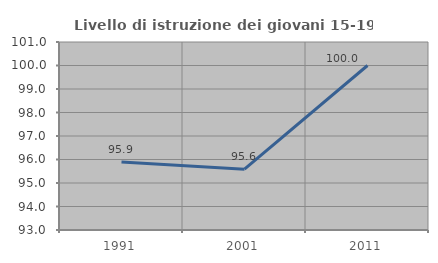
| Category | Livello di istruzione dei giovani 15-19 anni |
|---|---|
| 1991.0 | 95.89 |
| 2001.0 | 95.588 |
| 2011.0 | 100 |